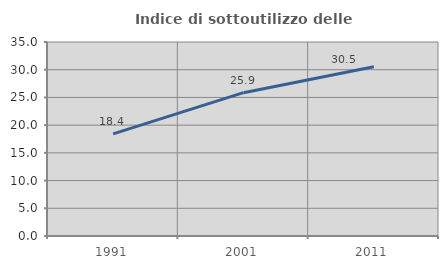
| Category | Indice di sottoutilizzo delle abitazioni  |
|---|---|
| 1991.0 | 18.431 |
| 2001.0 | 25.856 |
| 2011.0 | 30.547 |